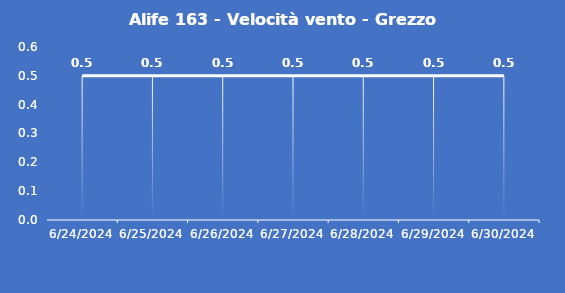
| Category | Alife 163 - Velocità vento - Grezzo (m/s) |
|---|---|
| 6/24/24 | 0.5 |
| 6/25/24 | 0.5 |
| 6/26/24 | 0.5 |
| 6/27/24 | 0.5 |
| 6/28/24 | 0.5 |
| 6/29/24 | 0.5 |
| 6/30/24 | 0.5 |